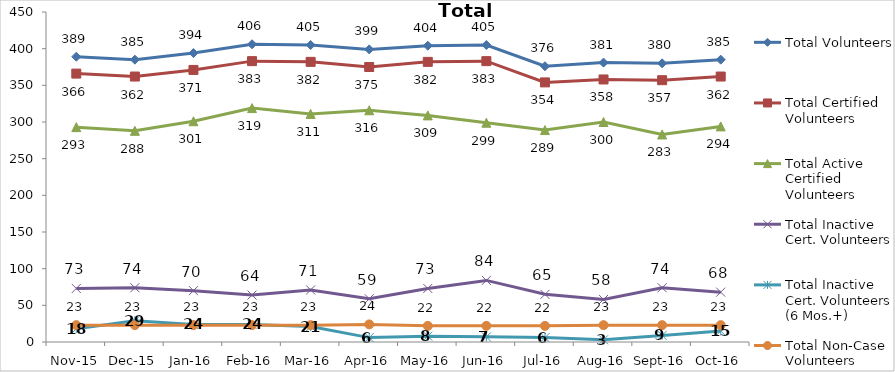
| Category | Total Volunteers | Total Certified Volunteers | Total Active Certified Volunteers | Total Inactive Cert. Volunteers | Total Inactive Cert. Volunteers (6 Mos.+) | Total Non-Case Volunteers |
|---|---|---|---|---|---|---|
| Nov-15 | 389 | 366 | 293 | 73 | 18 | 23 |
| Dec-15 | 385 | 362 | 288 | 74 | 29 | 23 |
| Jan-16 | 394 | 371 | 301 | 70 | 24 | 23 |
| Feb-16 | 406 | 383 | 319 | 64 | 24 | 23 |
| Mar-16 | 405 | 382 | 311 | 71 | 21 | 23 |
| Apr-16 | 399 | 375 | 316 | 59 | 6 | 24 |
| May-16 | 404 | 382 | 309 | 73 | 8 | 22 |
| Jun-16 | 405 | 383 | 299 | 84 | 7 | 22 |
| Jul-16 | 376 | 354 | 289 | 65 | 6 | 22 |
| Aug-16 | 381 | 358 | 300 | 58 | 3 | 23 |
| Sep-16 | 380 | 357 | 283 | 74 | 9 | 23 |
| Oct-16 | 385 | 362 | 294 | 68 | 15 | 23 |